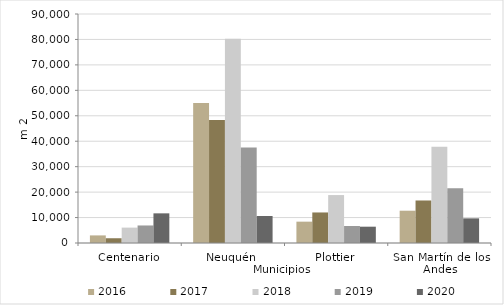
| Category | 2016 | 2017 | 2018 | 2019 | 2020 |
|---|---|---|---|---|---|
| Centenario | 2986 | 1868 | 6046 | 6890 | 11655 |
| Neuquén | 55041 | 48297 | 80252 | 37544 | 10611 |
| Plottier | 8388 | 12002 | 18838 | 6692 | 6410 |
| San Martín de los Andes | 12688 | 16709 | 37780 | 21534 | 9686 |